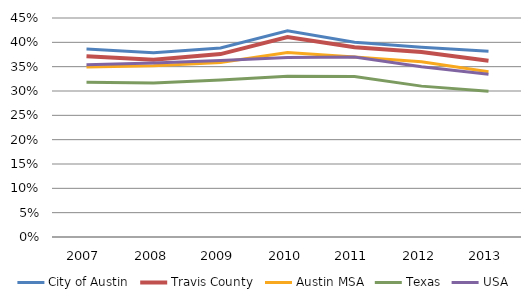
| Category | City of Austin | Travis County | Austin MSA | Texas | USA |
|---|---|---|---|---|---|
| 2007.0 | 0.386 | 0.371 | 0.349 | 0.318 | 0.354 |
| 2008.0 | 0.379 | 0.364 | 0.352 | 0.317 | 0.357 |
| 2009.0 | 0.388 | 0.376 | 0.358 | 0.322 | 0.363 |
| 2010.0 | 0.424 | 0.411 | 0.379 | 0.33 | 0.369 |
| 2011.0 | 0.4 | 0.39 | 0.37 | 0.33 | 0.37 |
| 2012.0 | 0.39 | 0.38 | 0.36 | 0.31 | 0.35 |
| 2013.0 | 0.382 | 0.362 | 0.34 | 0.299 | 0.335 |